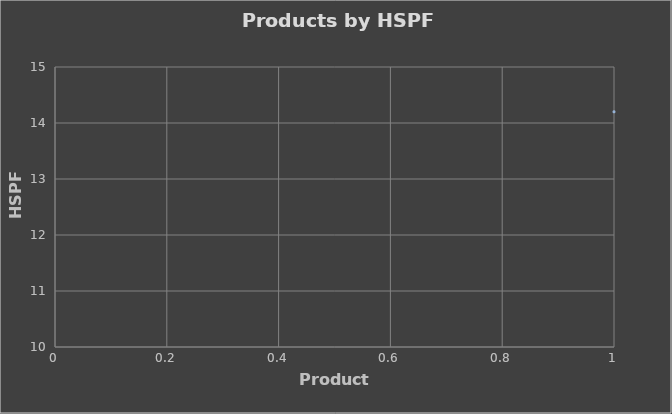
| Category | Series 0 |
|---|---|
| 0 | 14.2 |
| 1 | 14.2 |
| 2 | 14 |
| 3 | 14 |
| 4 | 14 |
| 5 | 14 |
| 6 | 13.8 |
| 7 | 13.8 |
| 8 | 13.4 |
| 9 | 13.4 |
| 10 | 13.3 |
| 11 | 13.3 |
| 12 | 13 |
| 13 | 12.6 |
| 14 | 12.5 |
| 15 | 12.5 |
| 16 | 12.5 |
| 17 | 12.5 |
| 18 | 12.5 |
| 19 | 12.5 |
| 20 | 12.4 |
| 21 | 12.2 |
| 22 | 12.2 |